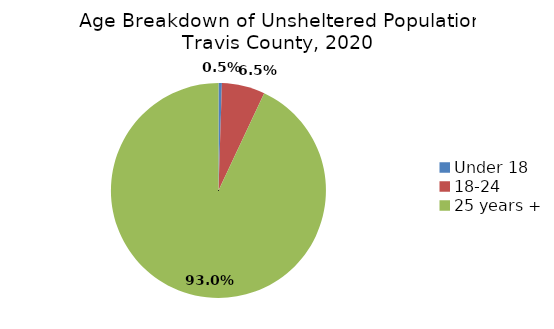
| Category | Percent of Total Unsheltered |
|---|---|
| Under 18 | 0.005 |
| 18-24 | 0.065 |
| 25 years + | 0.93 |